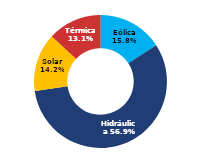
| Category | Sur |
|---|---|
| Eólica | 78.439 |
| Hidráulica | 282.51 |
| Solar | 70.43 |
| Térmica | 65.039 |